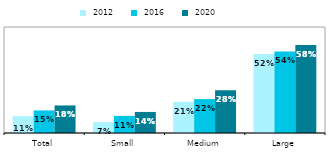
| Category |  2012 |  2016 |  2020 |
|---|---|---|---|
| Total | 0.111 | 0.149 | 0.182 |
| Small | 0.072 | 0.113 | 0.139 |
| Medium | 0.206 | 0.224 | 0.282 |
| Large | 0.521 | 0.539 | 0.581 |